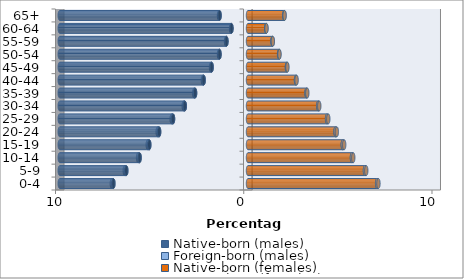
| Category | Native-born (males) | Foreign-born (males) | Native-born (females) | Foreign-born (females) |
|---|---|---|---|---|
| 0-4 | -7.152 | -0.083 | 6.861 | 0.068 |
| 5-9 | -6.466 | -0.081 | 6.213 | 0.069 |
| 10-14 | -5.759 | -0.079 | 5.522 | 0.069 |
| 15-19 | -5.244 | -0.082 | 5.036 | 0.073 |
| 20-24 | -4.721 | -0.076 | 4.65 | 0.069 |
| 25-29 | -3.982 | -0.072 | 4.2 | 0.065 |
| 30-34 | -3.356 | -0.059 | 3.732 | 0.053 |
| 35-39 | -2.811 | -0.05 | 3.107 | 0.043 |
| 40-44 | -2.355 | -0.041 | 2.549 | 0.033 |
| 45-49 | -1.932 | -0.032 | 2.069 | 0.024 |
| 50-54 | -1.513 | -0.027 | 1.653 | 0.019 |
| 55-59 | -1.145 | -0.022 | 1.302 | 0.015 |
| 60-64 | -0.878 | -0.02 | 0.969 | 0.013 |
| 65+ | -1.511 | -0.029 | 1.927 | 0.017 |